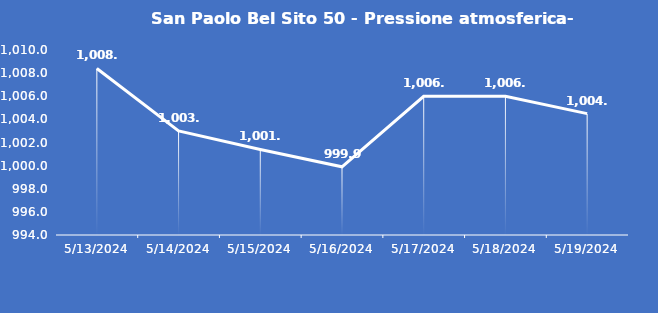
| Category | San Paolo Bel Sito 50 - Pressione atmosferica- Grezzo (hPa) |
|---|---|
| 5/13/24 | 1008.4 |
| 5/14/24 | 1003 |
| 5/15/24 | 1001.4 |
| 5/16/24 | 999.9 |
| 5/17/24 | 1006 |
| 5/18/24 | 1006 |
| 5/19/24 | 1004.5 |